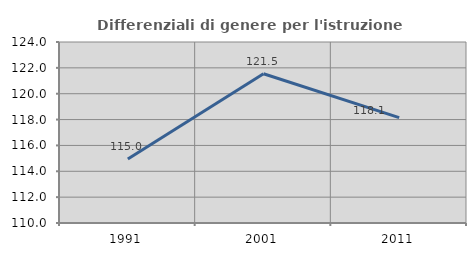
| Category | Differenziali di genere per l'istruzione superiore |
|---|---|
| 1991.0 | 114.951 |
| 2001.0 | 121.542 |
| 2011.0 | 118.146 |